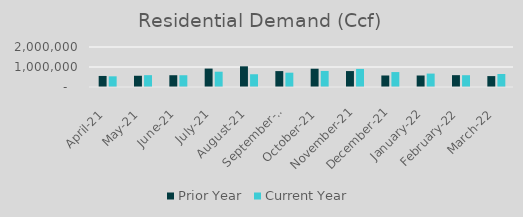
| Category | Prior Year | Current Year |
|---|---|---|
| 2021-04-01 | 552550.404 | 533967.423 |
| 2021-05-01 | 561680.927 | 591911.753 |
| 2021-06-01 | 588815.728 | 587861.265 |
| 2021-07-01 | 920418.723 | 764849.567 |
| 2021-08-01 | 1034271.241 | 637451.79 |
| 2021-09-01 | 795392.365 | 715703.433 |
| 2021-10-01 | 913450.318 | 802383.882 |
| 2021-11-01 | 796803.85 | 904247.352 |
| 2021-12-01 | 575698.992 | 746791.488 |
| 2022-01-01 | 574964.407 | 670556.394 |
| 2022-02-01 | 591912.627 | 589693.822 |
| 2022-03-01 | 545392.69 | 650741.307 |